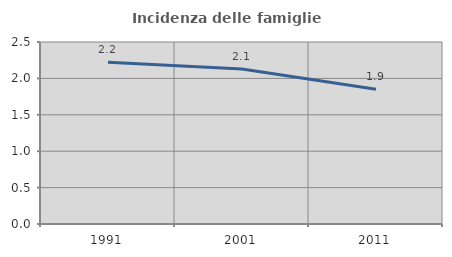
| Category | Incidenza delle famiglie numerose |
|---|---|
| 1991.0 | 2.222 |
| 2001.0 | 2.128 |
| 2011.0 | 1.852 |